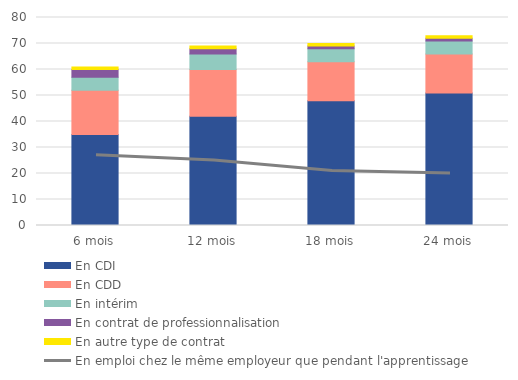
| Category | En CDI | En CDD | En intérim | En contrat de professionnalisation | En autre type de contrat |
|---|---|---|---|---|---|
| 6 mois | 35 | 17 | 5 | 3 | 1 |
| 12 mois | 42 | 18 | 6 | 2 | 1 |
| 18 mois | 48 | 15 | 5 | 1 | 1 |
| 24 mois | 51 | 15 | 5 | 1 | 1 |